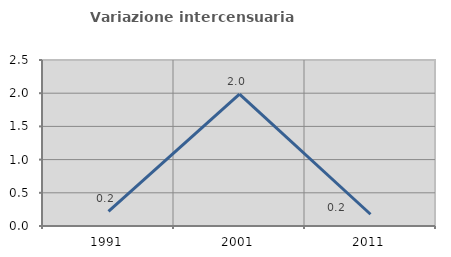
| Category | Variazione intercensuaria annua |
|---|---|
| 1991.0 | 0.22 |
| 2001.0 | 1.987 |
| 2011.0 | 0.177 |